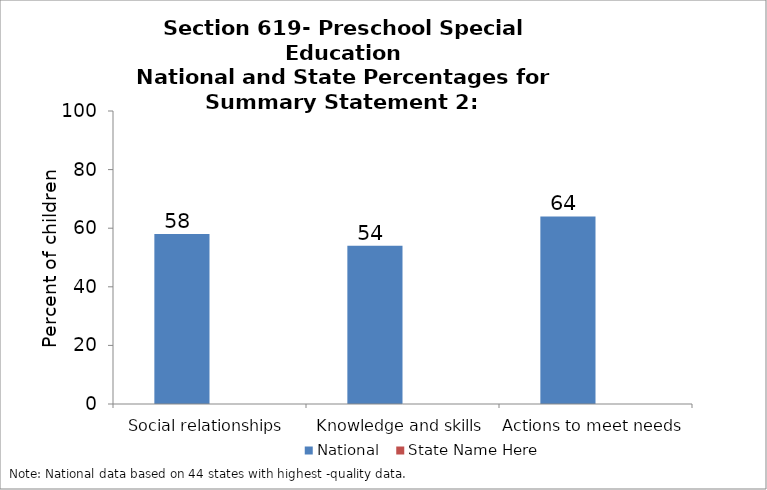
| Category | National | State Name Here |
|---|---|---|
| Social relationships | 58 |  |
| Knowledge and skills | 54 |  |
| Actions to meet needs | 64 |  |